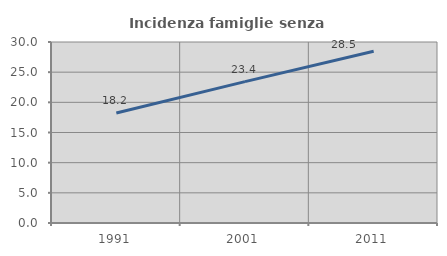
| Category | Incidenza famiglie senza nuclei |
|---|---|
| 1991.0 | 18.228 |
| 2001.0 | 23.432 |
| 2011.0 | 28.477 |